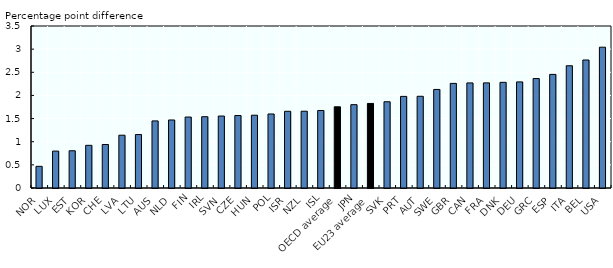
| Category | Series 0 |
|---|---|
| NOR | 0.468 |
| LUX | 0.798 |
| EST | 0.804 |
| KOR | 0.922 |
| CHE | 0.94 |
| LVA | 1.141 |
| LTU | 1.155 |
| AUS | 1.449 |
| NLD | 1.47 |
| FIN | 1.533 |
| IRL | 1.54 |
| SVN | 1.555 |
| CZE | 1.566 |
| HUN | 1.573 |
| POL | 1.599 |
| ISR | 1.657 |
| NZL | 1.659 |
| ISL | 1.674 |
| OECD average | 1.755 |
| JPN | 1.8 |
| EU23 average | 1.827 |
| SVK | 1.863 |
| PRT | 1.979 |
| AUT | 1.982 |
| SWE | 2.129 |
| GBR | 2.26 |
| CAN | 2.27 |
| FRA | 2.271 |
| DNK | 2.283 |
| DEU | 2.292 |
| GRC | 2.364 |
| ESP | 2.454 |
| ITA | 2.641 |
| BEL | 2.766 |
| USA | 3.042 |